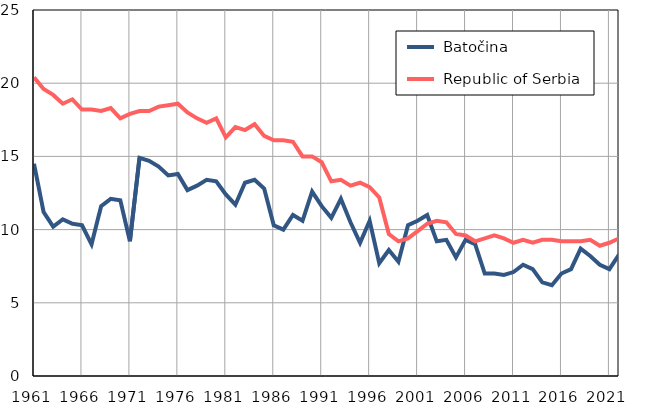
| Category |  Batočina |  Republic of Serbia |
|---|---|---|
| 1961.0 | 14.5 | 20.4 |
| 1962.0 | 11.2 | 19.6 |
| 1963.0 | 10.2 | 19.2 |
| 1964.0 | 10.7 | 18.6 |
| 1965.0 | 10.4 | 18.9 |
| 1966.0 | 10.3 | 18.2 |
| 1967.0 | 9 | 18.2 |
| 1968.0 | 11.6 | 18.1 |
| 1969.0 | 12.1 | 18.3 |
| 1970.0 | 12 | 17.6 |
| 1971.0 | 9.2 | 17.9 |
| 1972.0 | 14.9 | 18.1 |
| 1973.0 | 14.7 | 18.1 |
| 1974.0 | 14.3 | 18.4 |
| 1975.0 | 13.7 | 18.5 |
| 1976.0 | 13.8 | 18.6 |
| 1977.0 | 12.7 | 18 |
| 1978.0 | 13 | 17.6 |
| 1979.0 | 13.4 | 17.3 |
| 1980.0 | 13.3 | 17.6 |
| 1981.0 | 12.4 | 16.3 |
| 1982.0 | 11.7 | 17 |
| 1983.0 | 13.2 | 16.8 |
| 1984.0 | 13.4 | 17.2 |
| 1985.0 | 12.8 | 16.4 |
| 1986.0 | 10.3 | 16.1 |
| 1987.0 | 10 | 16.1 |
| 1988.0 | 11 | 16 |
| 1989.0 | 10.6 | 15 |
| 1990.0 | 12.6 | 15 |
| 1991.0 | 11.6 | 14.6 |
| 1992.0 | 10.8 | 13.3 |
| 1993.0 | 12.1 | 13.4 |
| 1994.0 | 10.5 | 13 |
| 1995.0 | 9.1 | 13.2 |
| 1996.0 | 10.6 | 12.9 |
| 1997.0 | 7.7 | 12.2 |
| 1998.0 | 8.6 | 9.7 |
| 1999.0 | 7.8 | 9.2 |
| 2000.0 | 10.3 | 9.4 |
| 2001.0 | 10.6 | 9.9 |
| 2002.0 | 11 | 10.4 |
| 2003.0 | 9.2 | 10.6 |
| 2004.0 | 9.3 | 10.5 |
| 2005.0 | 8.1 | 9.7 |
| 2006.0 | 9.3 | 9.6 |
| 2007.0 | 9 | 9.2 |
| 2008.0 | 7 | 9.4 |
| 2009.0 | 7 | 9.6 |
| 2010.0 | 6.9 | 9.4 |
| 2011.0 | 7.1 | 9.1 |
| 2012.0 | 7.6 | 9.3 |
| 2013.0 | 7.3 | 9.1 |
| 2014.0 | 6.4 | 9.3 |
| 2015.0 | 6.2 | 9.3 |
| 2016.0 | 7 | 9.2 |
| 2017.0 | 7.3 | 9.2 |
| 2018.0 | 8.7 | 9.2 |
| 2019.0 | 8.2 | 9.3 |
| 2020.0 | 7.6 | 8.9 |
| 2021.0 | 7.3 | 9.1 |
| 2022.0 | 8.3 | 9.4 |